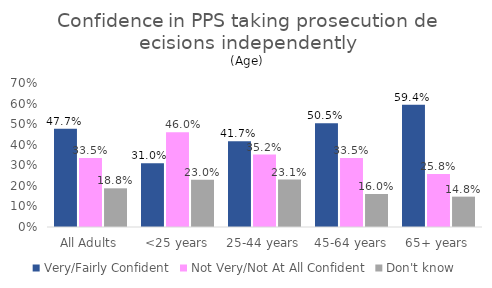
| Category | Very/Fairly Confident | Not Very/Not At All Confident | Don't know |
|---|---|---|---|
| All Adults | 0.477 | 0.335 | 0.188 |
| <25 years | 0.31 | 0.46 | 0.23 |
| 25-44 years | 0.417 | 0.352 | 0.231 |
| 45-64 years | 0.505 | 0.335 | 0.16 |
| 65+ years | 0.594 | 0.258 | 0.148 |